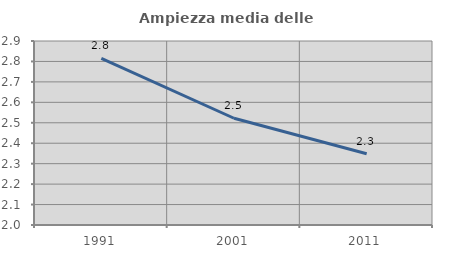
| Category | Ampiezza media delle famiglie |
|---|---|
| 1991.0 | 2.815 |
| 2001.0 | 2.522 |
| 2011.0 | 2.348 |